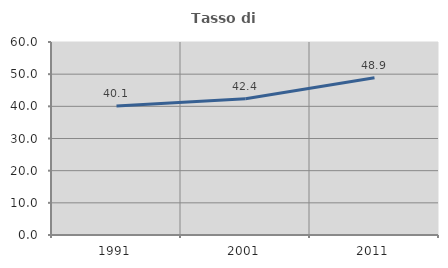
| Category | Tasso di occupazione   |
|---|---|
| 1991.0 | 40.07 |
| 2001.0 | 42.377 |
| 2011.0 | 48.867 |